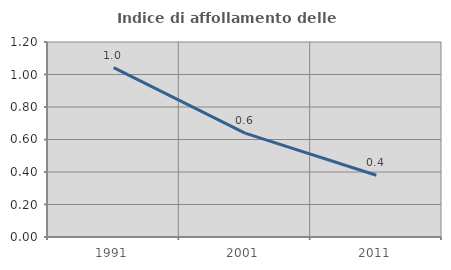
| Category | Indice di affollamento delle abitazioni  |
|---|---|
| 1991.0 | 1.043 |
| 2001.0 | 0.639 |
| 2011.0 | 0.38 |